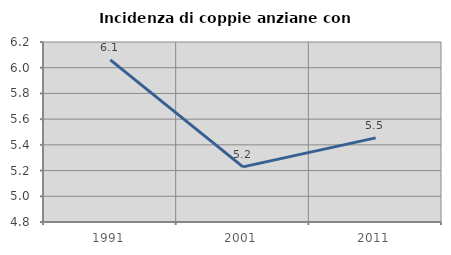
| Category | Incidenza di coppie anziane con figli |
|---|---|
| 1991.0 | 6.061 |
| 2001.0 | 5.229 |
| 2011.0 | 5.455 |